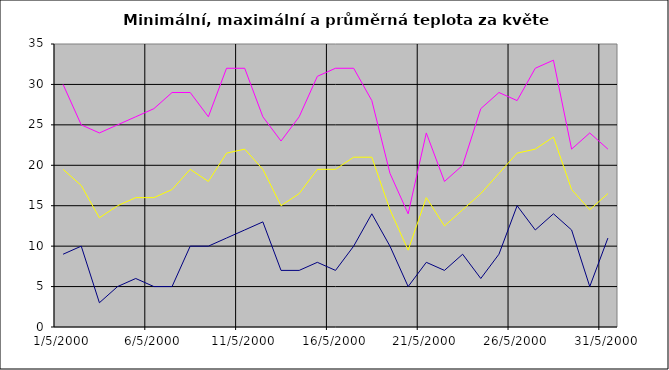
| Category | Series 0 | Series 1 | Series 2 |
|---|---|---|---|
| 2000-05-01 | 9 | 30 | 19.5 |
| 2000-05-02 | 10 | 25 | 17.5 |
| 2000-05-03 | 3 | 24 | 13.5 |
| 2000-05-04 | 5 | 25 | 15 |
| 2000-05-05 | 6 | 26 | 16 |
| 2000-05-06 | 5 | 27 | 16 |
| 2000-05-07 | 5 | 29 | 17 |
| 2000-05-08 | 10 | 29 | 19.5 |
| 2000-05-09 | 10 | 26 | 18 |
| 2000-05-10 | 11 | 32 | 21.5 |
| 2000-05-11 | 12 | 32 | 22 |
| 2000-05-12 | 13 | 26 | 19.5 |
| 2000-05-13 | 7 | 23 | 15 |
| 2000-05-14 | 7 | 26 | 16.5 |
| 2000-05-15 | 8 | 31 | 19.5 |
| 2000-05-16 | 7 | 32 | 19.5 |
| 2000-05-17 | 10 | 32 | 21 |
| 2000-05-18 | 14 | 28 | 21 |
| 2000-05-19 | 10 | 19 | 14.5 |
| 2000-05-20 | 5 | 14 | 9.5 |
| 2000-05-21 | 8 | 24 | 16 |
| 2000-05-22 | 7 | 18 | 12.5 |
| 2000-05-23 | 9 | 20 | 14.5 |
| 2000-05-24 | 6 | 27 | 16.5 |
| 2000-05-25 | 9 | 29 | 19 |
| 2000-05-26 | 15 | 28 | 21.5 |
| 2000-05-27 | 12 | 32 | 22 |
| 2000-05-28 | 14 | 33 | 23.5 |
| 2000-05-29 | 12 | 22 | 17 |
| 2000-05-30 | 5 | 24 | 14.5 |
| 2000-05-31 | 11 | 22 | 16.5 |